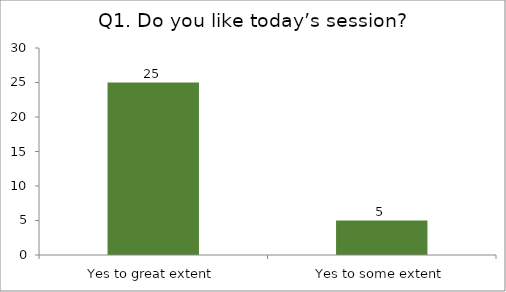
| Category | Q1. Do you like today’s session? |
|---|---|
| Yes to great extent | 25 |
| Yes to some extent | 5 |